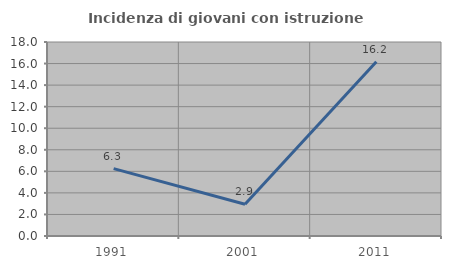
| Category | Incidenza di giovani con istruzione universitaria |
|---|---|
| 1991.0 | 6.25 |
| 2001.0 | 2.941 |
| 2011.0 | 16.162 |